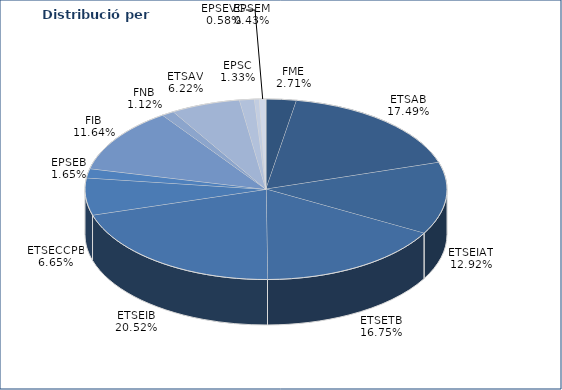
| Category | Series 0 |
|---|---|
| FME | 51 |
| ETSAB | 329 |
| ETSEIAT | 243 |
| ETSETB | 315 |
| ETSEIB | 386 |
| ETSECCPB | 125 |
| EPSEB | 31 |
| FIB | 219 |
| FNB | 21 |
| ETSAV | 117 |
| EPSC | 25 |
| EPSEM | 8 |
| EPSEVG | 11 |